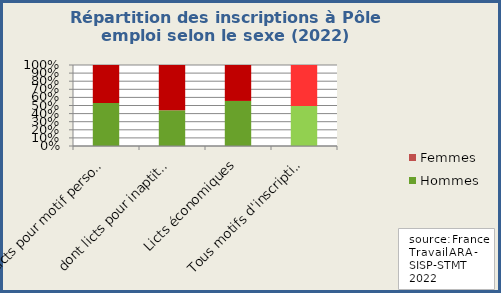
| Category | Hommes | Femmes |
|---|---|---|
| 0 | 0.53 | 0.47 |
| 1 | 0.441 | 0.559 |
| 2 | 0.556 | 0.444 |
| 3 | 0.494 | 0.506 |